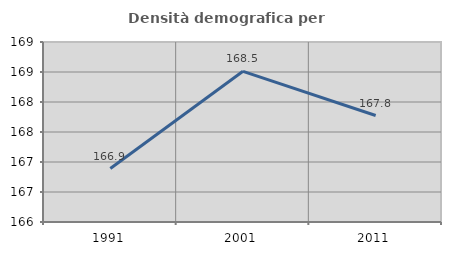
| Category | Densità demografica |
|---|---|
| 1991.0 | 166.891 |
| 2001.0 | 168.511 |
| 2011.0 | 167.775 |